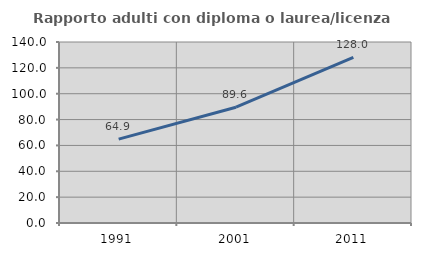
| Category | Rapporto adulti con diploma o laurea/licenza media  |
|---|---|
| 1991.0 | 64.875 |
| 2001.0 | 89.571 |
| 2011.0 | 128.028 |